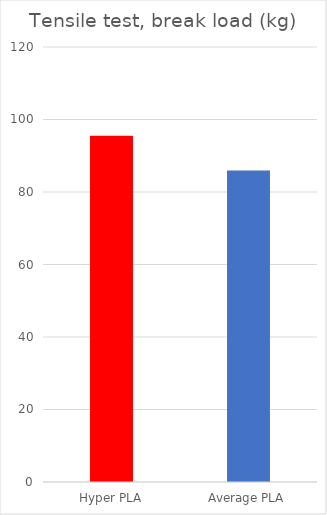
| Category | Average |
|---|---|
| Hyper PLA | 95.5 |
| Average PLA | 85.9 |